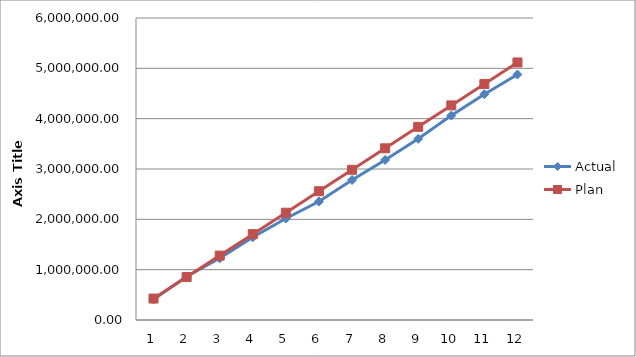
| Category | Actual | Plan |
|---|---|---|
| 0 | 409274.18 | 426383.333 |
| 1 | 864082.96 | 852766.667 |
| 2 | 1225870.38 | 1279150 |
| 3 | 1644518.51 | 1705533.333 |
| 4 | 2016295.81 | 2131916.667 |
| 5 | 2354203.8 | 2558300 |
| 6 | 2781969.93 | 2984683.333 |
| 7 | 3180438.44 | 3411066.667 |
| 8 | 3599708 | 3837450 |
| 9 | 4061233.21 | 4263833.333 |
| 10 | 4485669.44 | 4690216.667 |
| 11 | 4877361.35 | 5116600 |